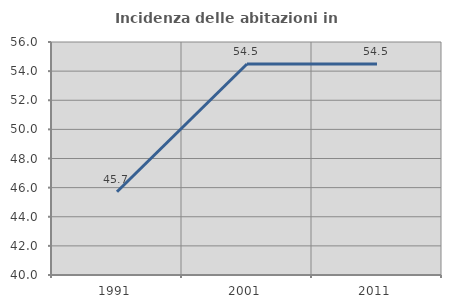
| Category | Incidenza delle abitazioni in proprietà  |
|---|---|
| 1991.0 | 45.714 |
| 2001.0 | 54.493 |
| 2011.0 | 54.496 |